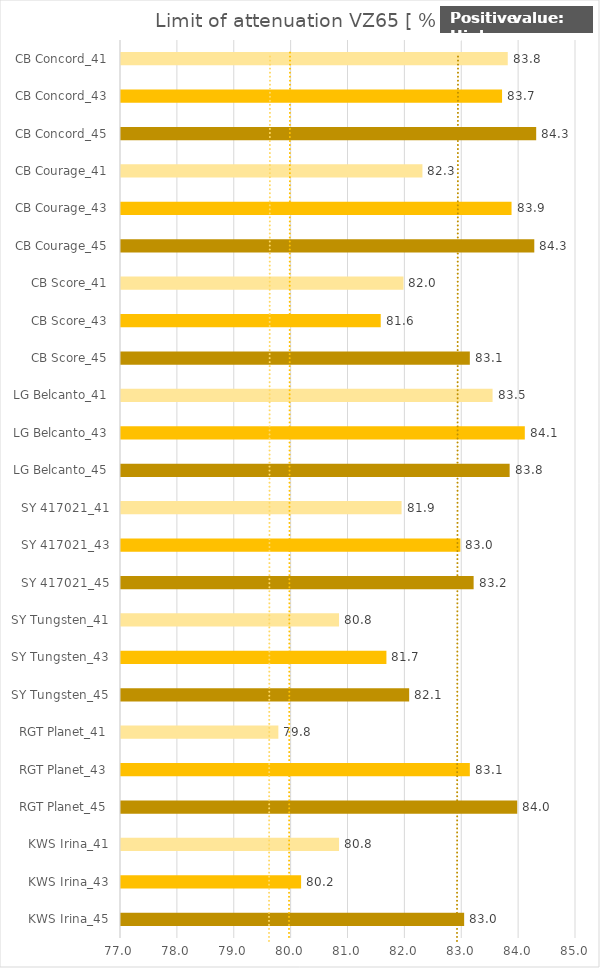
| Category |   Limit of attenuation VZ65 [ % ]  |
|---|---|
| KWS Irina_45 | 83.033 |
| KWS Irina_43 | 80.167 |
| KWS Irina_41 | 80.833 |
| RGT Planet_45 | 83.967 |
| RGT Planet_43 | 83.133 |
| RGT Planet_41 | 79.767 |
| SY Tungsten_45 | 82.067 |
| SY Tungsten_43 | 81.667 |
| SY Tungsten_41 | 80.833 |
| SY 417021_45 | 83.2 |
| SY 417021_43 | 82.967 |
| SY 417021_41 | 81.933 |
| LG Belcanto_45 | 83.833 |
| LG Belcanto_43 | 84.1 |
| LG Belcanto_41 | 83.533 |
| CB Score_45 | 83.133 |
| CB Score_43 | 81.567 |
| CB Score_41 | 81.967 |
| CB Courage_45 | 84.267 |
| CB Courage_43 | 83.867 |
| CB Courage_41 | 82.3 |
| CB Concord_45 | 84.3 |
| CB Concord_43 | 83.7 |
| CB Concord_41 | 83.8 |